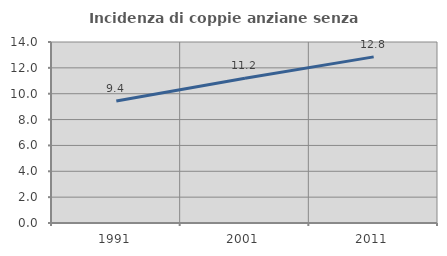
| Category | Incidenza di coppie anziane senza figli  |
|---|---|
| 1991.0 | 9.436 |
| 2001.0 | 11.195 |
| 2011.0 | 12.85 |